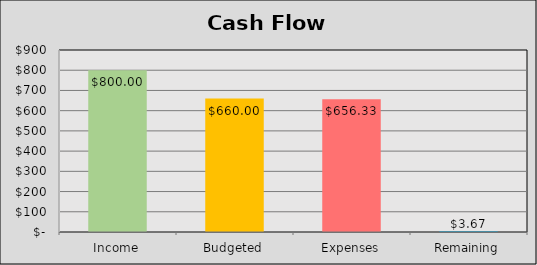
| Category | Series 1 |
|---|---|
| Income | 800 |
| Budgeted | 660 |
| Expenses | 656.33 |
| Remaining | 3.67 |